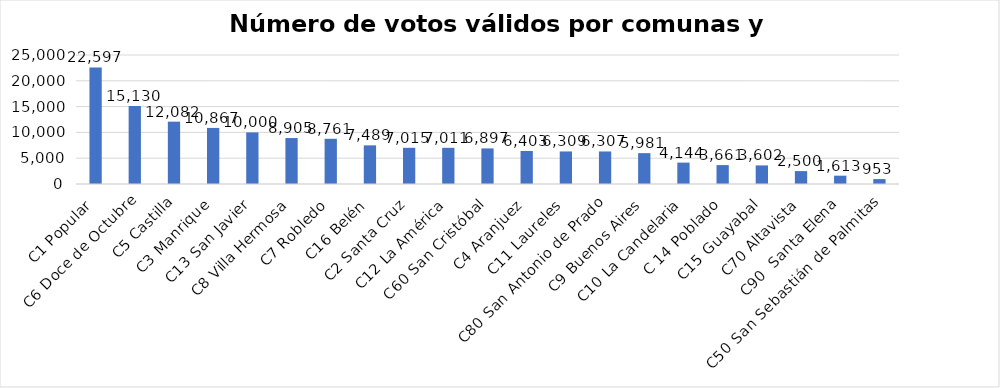
| Category | Series 0 |
|---|---|
| C1 Popular | 22597 |
| C6 Doce de Octubre | 15130 |
| C5 Castilla | 12082 |
| C3 Manrique | 10867 |
| C13 San Javier | 10000 |
| C8 Villa Hermosa | 8905 |
| C7 Robledo | 8761 |
| C16 Belén | 7489 |
| C2 Santa Cruz | 7015 |
| C12 La América | 7011 |
| C60 San Cristóbal | 6897 |
| C4 Aranjuez | 6403 |
| C11 Laureles | 6309 |
| C80 San Antonio de Prado | 6307 |
| C9 Buenos Aires | 5981 |
| C10 La Candelaria | 4144 |
| C 14 Poblado | 3661 |
| C15 Guayabal | 3602 |
| C70 Altavista | 2500 |
| C90  Santa Elena | 1613 |
| C50 San Sebastián de Palmitas  | 953 |